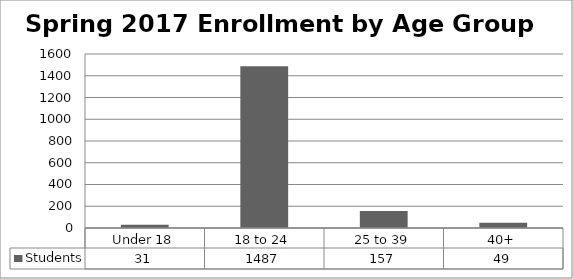
| Category | Students |
|---|---|
| Under 18 | 31 |
| 18 to 24 | 1487 |
| 25 to 39 | 157 |
| 40+ | 49 |